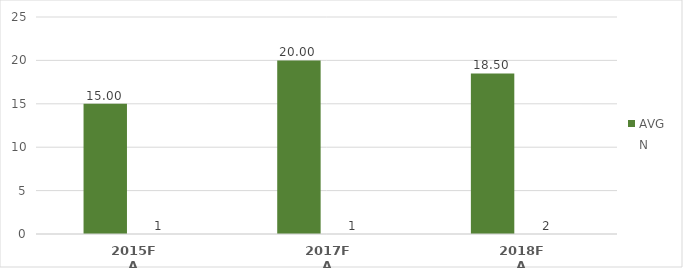
| Category | AVG | N |
|---|---|---|
| 2015FA | 15 | 1 |
| 2017FA | 20 | 1 |
| 2018FA | 18.5 | 2 |